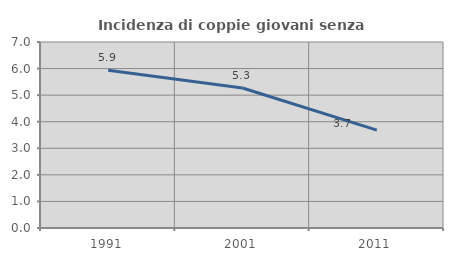
| Category | Incidenza di coppie giovani senza figli |
|---|---|
| 1991.0 | 5.94 |
| 2001.0 | 5.268 |
| 2011.0 | 3.683 |